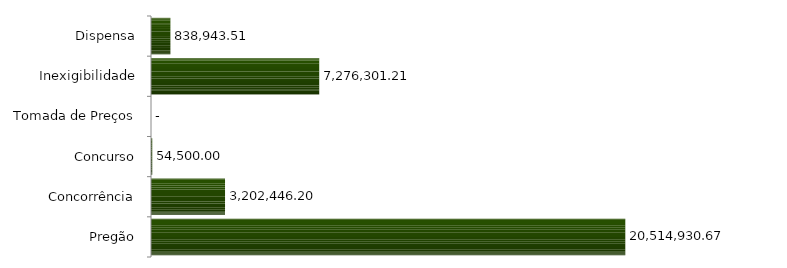
| Category | Series 0 |
|---|---|
| Pregão | 20514930.67 |
| Concorrência | 3202446.2 |
| Concurso | 54500 |
| Tomada de Preços | 0 |
| Inexigibilidade | 7276301.21 |
| Dispensa | 838943.51 |